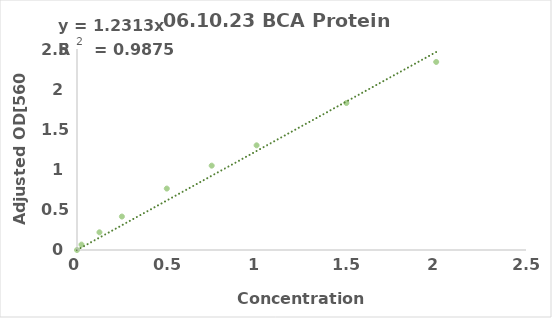
| Category | Series 0 |
|---|---|
| 0.0 | 0 |
| 0.025 | 0.067 |
| 0.125 | 0.22 |
| 0.25 | 0.416 |
| 0.5 | 0.764 |
| 0.75 | 1.049 |
| 1.0 | 1.302 |
| 1.5 | 1.828 |
| 2.0 | 2.339 |